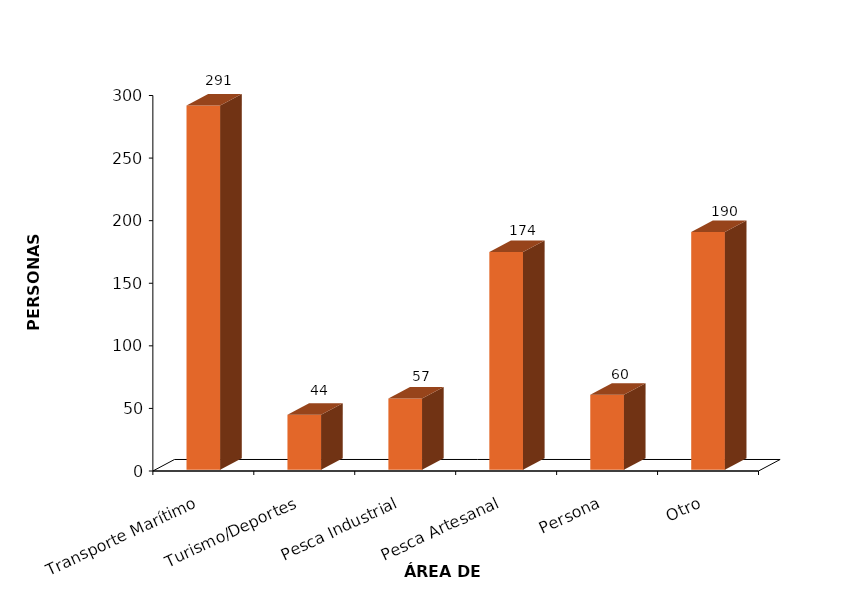
| Category | Series 0 |
|---|---|
| Transporte Marítimo | 291 |
| Turismo/Deportes | 44 |
| Pesca Industrial | 57 |
| Pesca Artesanal | 174 |
| Persona | 60 |
| Otro | 190 |